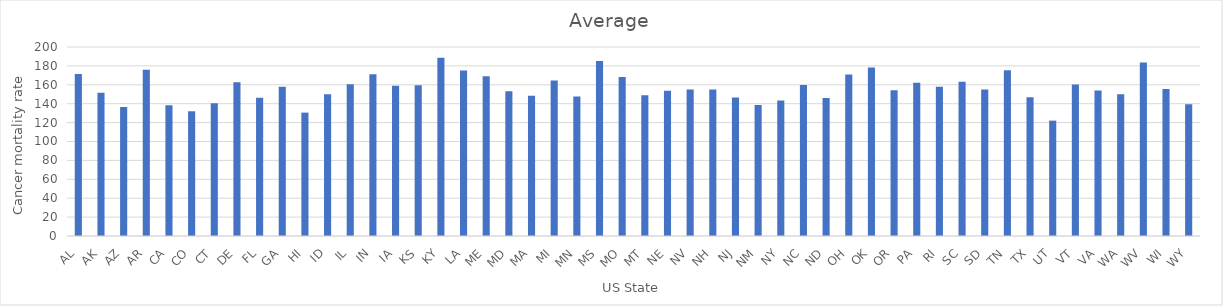
| Category | Average |
|---|---|
| AL | 171.4 |
| AK | 151.717 |
| AZ | 136.6 |
| AR | 175.9 |
| CA | 138.317 |
| CO | 131.983 |
| CT | 140.55 |
| DE | 162.567 |
| FL | 146.183 |
| GA | 157.9 |
| HI | 130.567 |
| ID | 150.117 |
| IL | 160.55 |
| IN | 171.267 |
| IA | 159.017 |
| KS | 159.567 |
| KY | 188.7 |
| LA | 175.033 |
| ME | 169.05 |
| MD | 153.167 |
| MA | 148.433 |
| MI | 164.667 |
| MN | 147.717 |
| MS | 185.183 |
| MO | 168.383 |
| MT | 148.883 |
| NE | 153.583 |
| NV | 154.967 |
| NH | 155.067 |
| NJ | 146.5 |
| NM | 138.517 |
| NY | 143.333 |
| NC | 159.817 |
| ND | 146.067 |
| OH | 170.95 |
| OK | 178.4 |
| OR | 154.35 |
| PA | 162.1 |
| RI | 157.917 |
| SC | 163.283 |
| SD | 154.933 |
| TN | 175.5 |
| TX | 146.9 |
| UT | 122.083 |
| VT | 160.417 |
| VA | 153.983 |
| WA | 149.983 |
| WV | 183.6 |
| WI | 155.567 |
| WY | 139.433 |